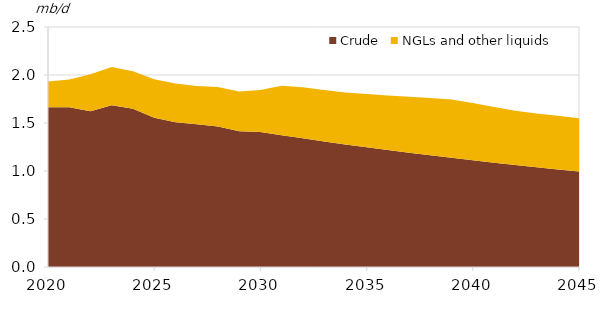
| Category | Crude | NGLs and other liquids |
|---|---|---|
| 2020-01-01 | 1.663 | 0.269 |
| 2021-01-01 | 1.665 | 0.289 |
| 2022-01-01 | 1.622 | 0.385 |
| 2023-01-01 | 1.684 | 0.399 |
| 2024-01-01 | 1.648 | 0.391 |
| 2025-01-01 | 1.555 | 0.401 |
| 2026-01-01 | 1.509 | 0.403 |
| 2027-01-01 | 1.486 | 0.399 |
| 2028-01-01 | 1.464 | 0.411 |
| 2029-01-01 | 1.414 | 0.414 |
| 2030-01-01 | 1.407 | 0.435 |
| 2031-01-01 | 1.373 | 0.515 |
| 2032-01-01 | 1.34 | 0.531 |
| 2033-01-01 | 1.308 | 0.535 |
| 2034-01-01 | 1.277 | 0.541 |
| 2035-01-01 | 1.247 | 0.554 |
| 2036-01-01 | 1.218 | 0.568 |
| 2037-01-01 | 1.19 | 0.584 |
| 2038-01-01 | 1.163 | 0.596 |
| 2039-01-01 | 1.137 | 0.607 |
| 2040-01-01 | 1.111 | 0.597 |
| 2041-01-01 | 1.086 | 0.579 |
| 2042-01-01 | 1.062 | 0.565 |
| 2043-01-01 | 1.039 | 0.56 |
| 2044-01-01 | 1.016 | 0.56 |
| 2045-01-01 | 0.994 | 0.556 |